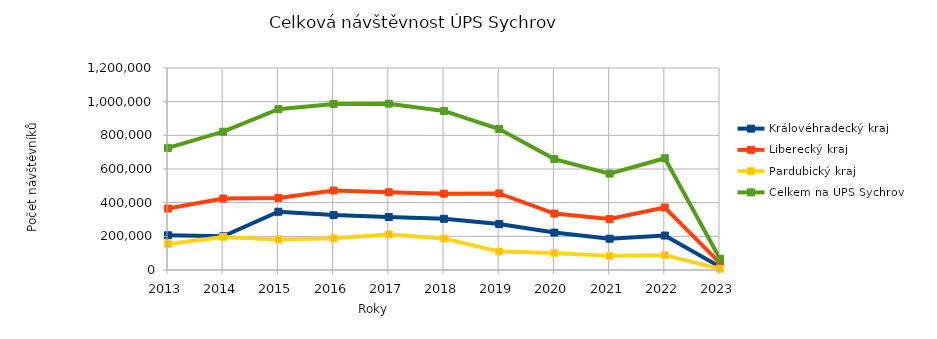
| Category | Královéhradecký kraj | Liberecký kraj | Pardubický kraj | Celkem na ÚPS Sychrov |
|---|---|---|---|---|
| 2013.0 | 206419 | 365108 | 154165 | 725692 |
| 2014.0 | 200438 | 424718 | 196473 | 821629 |
| 2015.0 | 345970 | 428023 | 181567 | 955560 |
| 2016.0 | 326137 | 472318 | 188108 | 986563 |
| 2017.0 | 314983 | 461803 | 211268 | 988054 |
| 2018.0 | 304267 | 453568 | 187017 | 944852 |
| 2019.0 | 272720 | 454785 | 109949 | 837454 |
| 2020.0 | 222238 | 335261 | 101211 | 658710 |
| 2021.0 | 185934 | 302574 | 83925 | 572433 |
| 2022.0 | 204678 | 371041 | 88282 | 664001 |
| 2023.0 | 18514 | 41435 | 6957 | 66906 |